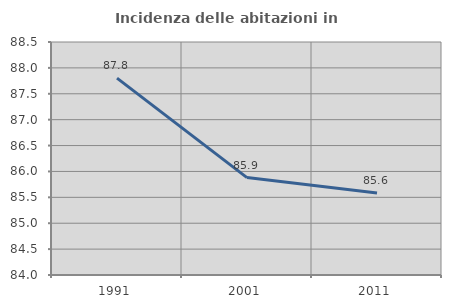
| Category | Incidenza delle abitazioni in proprietà  |
|---|---|
| 1991.0 | 87.802 |
| 2001.0 | 85.881 |
| 2011.0 | 85.585 |